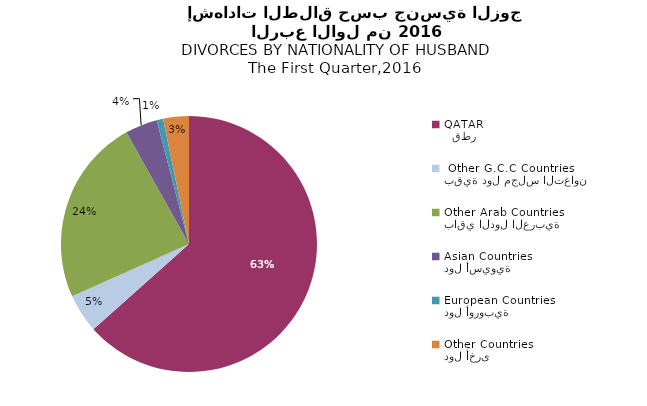
| Category | Series 1 |
|---|---|
|   قطر
QATAR | 156 |
| بقية دول مجلس التعاون
 Other G.C.C Countries | 12 |
| باقي الدول العربية
Other Arab Countries | 58 |
| دول أسيوية
Asian Countries | 10 |
| دول أوروبية
European Countries | 2 |
| دول أخرى
Other Countries | 8 |